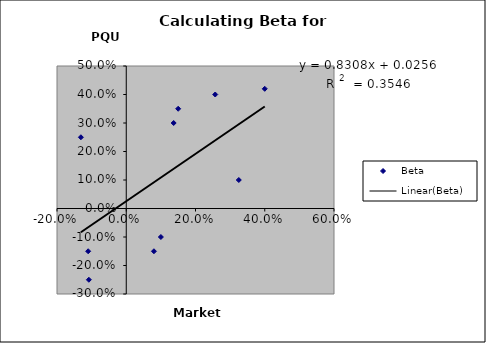
| Category | Beta |
|---|---|
| 0.257 | 0.4 |
| 0.08 | -0.15 |
| -0.11 | -0.15 |
| 0.15 | 0.35 |
| 0.325 | 0.1 |
| 0.137 | 0.3 |
| 0.4 | 0.42 |
| 0.1 | -0.1 |
| -0.108 | -0.25 |
| -0.131 | 0.25 |